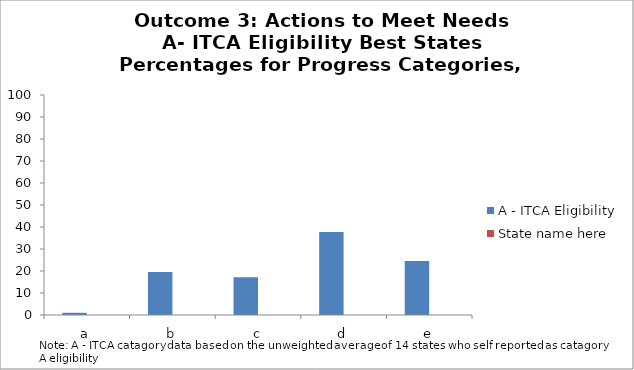
| Category | A - ITCA Eligibility | State name here |
|---|---|---|
| a | 1 |  |
| b | 19.6 |  |
| c | 17.2 |  |
| d | 37.7 |  |
| e | 24.5 |  |